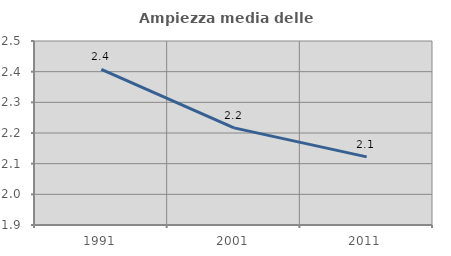
| Category | Ampiezza media delle famiglie |
|---|---|
| 1991.0 | 2.407 |
| 2001.0 | 2.217 |
| 2011.0 | 2.122 |